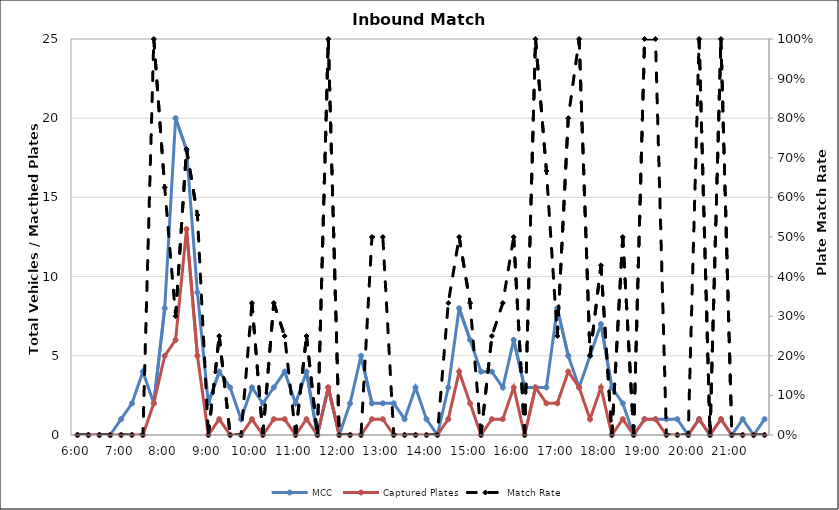
| Category | MCC | Captured Plates |
|---|---|---|
| 0.25 | 0 | 0 |
| 0.260416666666667 | 0 | 0 |
| 0.270833333333333 | 0 | 0 |
| 0.28125 | 0 | 0 |
| 0.291666666666667 | 1 | 0 |
| 0.302083333333333 | 2 | 0 |
| 0.3125 | 4 | 0 |
| 0.322916666666667 | 2 | 2 |
| 0.333333333333333 | 8 | 5 |
| 0.34375 | 20 | 6 |
| 0.354166666666667 | 18 | 13 |
| 0.364583333333333 | 9 | 5 |
| 0.375 | 2 | 0 |
| 0.385416666666667 | 4 | 1 |
| 0.395833333333333 | 3 | 0 |
| 0.40625 | 1 | 0 |
| 0.416666666666667 | 3 | 1 |
| 0.427083333333333 | 2 | 0 |
| 0.4375 | 3 | 1 |
| 0.447916666666667 | 4 | 1 |
| 0.458333333333333 | 2 | 0 |
| 0.46875 | 4 | 1 |
| 0.479166666666667 | 0 | 0 |
| 0.489583333333333 | 3 | 3 |
| 0.5 | 0 | 0 |
| 0.510416666666667 | 2 | 0 |
| 0.520833333333333 | 5 | 0 |
| 0.53125 | 2 | 1 |
| 0.541666666666667 | 2 | 1 |
| 0.552083333333333 | 2 | 0 |
| 0.5625 | 1 | 0 |
| 0.572916666666667 | 3 | 0 |
| 0.583333333333333 | 1 | 0 |
| 0.59375 | 0 | 0 |
| 0.604166666666667 | 3 | 1 |
| 0.614583333333333 | 8 | 4 |
| 0.625 | 6 | 2 |
| 0.635416666666667 | 4 | 0 |
| 0.645833333333333 | 4 | 1 |
| 0.65625 | 3 | 1 |
| 0.666666666666667 | 6 | 3 |
| 0.677083333333333 | 3 | 0 |
| 0.6875 | 3 | 3 |
| 0.697916666666667 | 3 | 2 |
| 0.708333333333333 | 8 | 2 |
| 0.71875 | 5 | 4 |
| 0.729166666666667 | 3 | 3 |
| 0.739583333333333 | 5 | 1 |
| 0.75 | 7 | 3 |
| 0.760416666666667 | 3 | 0 |
| 0.770833333333333 | 2 | 1 |
| 0.78125 | 0 | 0 |
| 0.791666666666667 | 1 | 1 |
| 0.802083333333333 | 1 | 1 |
| 0.8125 | 1 | 0 |
| 0.822916666666667 | 1 | 0 |
| 0.833333333333333 | 0 | 0 |
| 0.84375 | 1 | 1 |
| 0.854166666666667 | 0 | 0 |
| 0.864583333333333 | 1 | 1 |
| 0.875 | 0 | 0 |
| 0.885416666666667 | 1 | 0 |
| 0.895833333333333 | 0 | 0 |
| 0.90625 | 1 | 0 |